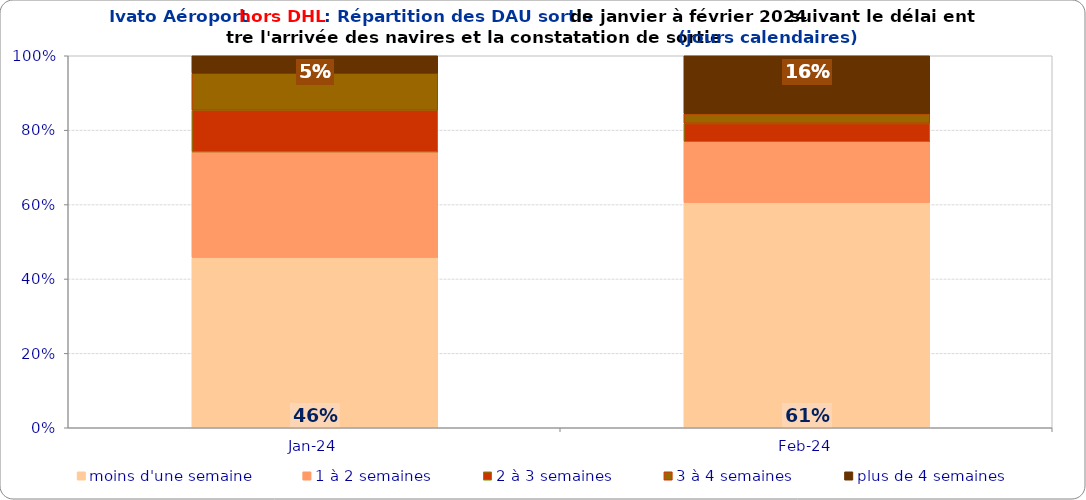
| Category | moins d'une semaine | 1 à 2 semaines | 2 à 3 semaines | 3 à 4 semaines | plus de 4 semaines |
|---|---|---|---|---|---|
| 2024-01-01 | 0.458 | 0.283 | 0.112 | 0.1 | 0.047 |
| 2024-02-01 | 0.605 | 0.164 | 0.049 | 0.026 | 0.156 |